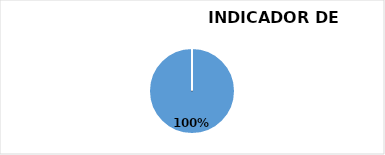
| Category | % ( CUMPLIMIENTO  ) |
|---|---|
| 0 | 1 |